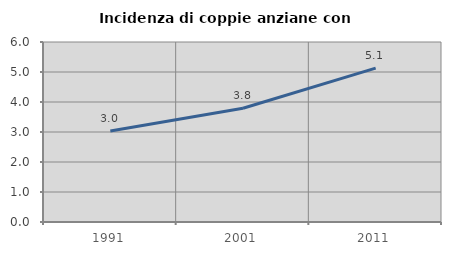
| Category | Incidenza di coppie anziane con figli |
|---|---|
| 1991.0 | 3.032 |
| 2001.0 | 3.793 |
| 2011.0 | 5.131 |